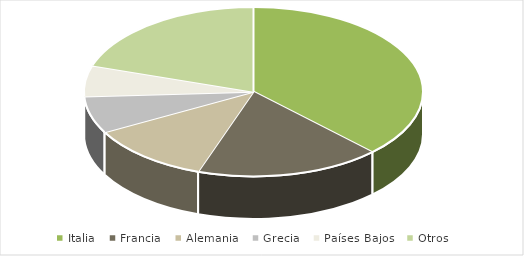
| Category | Series 0 |
|---|---|
| Italia | 0.376 |
| Francia | 0.176 |
| Alemania | 0.118 |
| Grecia | 0.071 |
| Países Bajos | 0.059 |
| Otros | 0.2 |